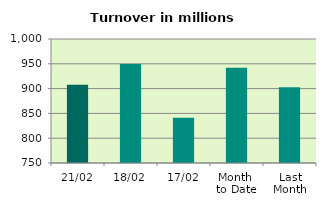
| Category | Series 0 |
|---|---|
| 21/02 | 907.643 |
| 18/02 | 949.71 |
| 17/02 | 841.189 |
| Month 
to Date | 941.815 |
| Last
Month | 902.557 |